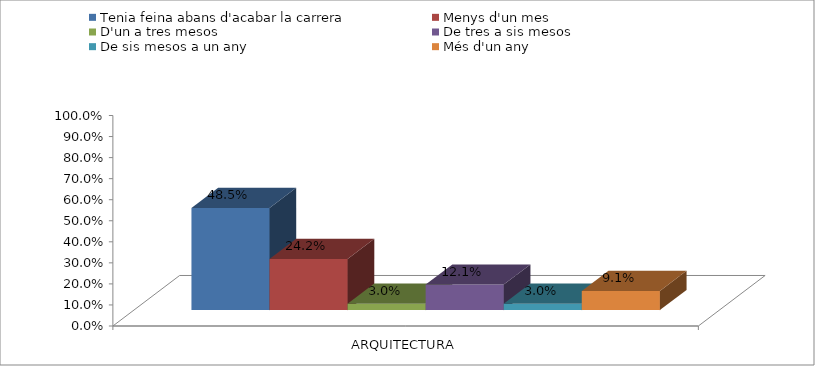
| Category | Tenia feina abans d'acabar la carrera | Menys d'un mes | D'un a tres mesos | De tres a sis mesos | De sis mesos a un any | Més d'un any |
|---|---|---|---|---|---|---|
| ARQUITECTURA | 0.485 | 0.242 | 0.03 | 0.121 | 0.03 | 0.091 |